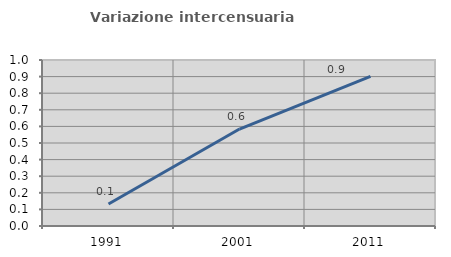
| Category | Variazione intercensuaria annua |
|---|---|
| 1991.0 | 0.133 |
| 2001.0 | 0.584 |
| 2011.0 | 0.901 |